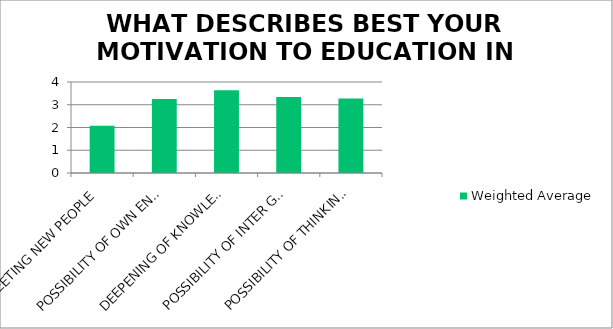
| Category | Weighted Average |
|---|---|
| MEETING NEW PEOPLE | 2.08 |
| POSSIBILITY OF OWN ENGAGEMENT IN THE U3A COURSE | 3.25 |
| DEEPENING OF KNOWLEDGE IN INFORMATION TECHNOLOGY | 3.64 |
| POSSIBILITY OF INTER GENERATION DIALOGUE WITH YOUNG PEOPLE | 3.34 |
| POSSIBILITY OF THINKING ABOUT THE HISTORY OF OUR FAMILY AND MY OWN BIOGRAPHY STORY | 3.28 |